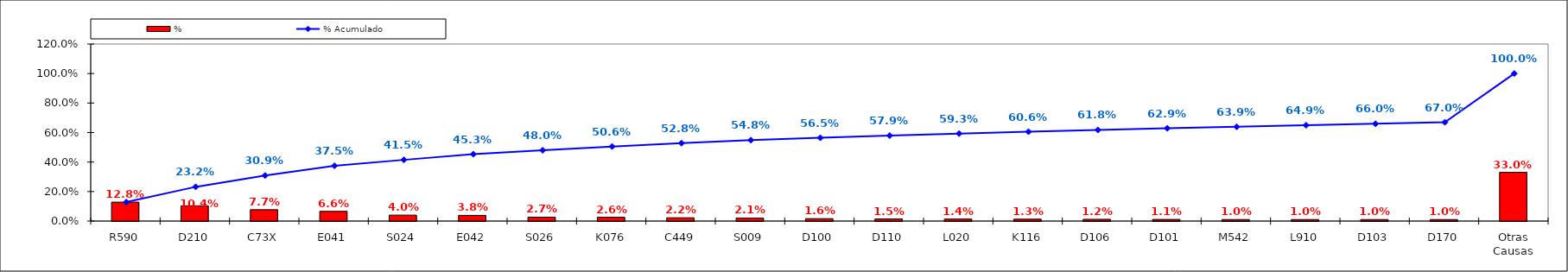
| Category | % |
|---|---|
| R590 | 0.128 |
| D210 | 0.104 |
| C73X | 0.077 |
| E041 | 0.066 |
| S024 | 0.04 |
| E042 | 0.038 |
| S026 | 0.027 |
| K076 | 0.026 |
| C449 | 0.022 |
| S009 | 0.021 |
| D100 | 0.016 |
| D110 | 0.015 |
| L020 | 0.014 |
| K116 | 0.013 |
| D106 | 0.012 |
| D101 | 0.011 |
| M542 | 0.01 |
| L910 | 0.01 |
| D103 | 0.01 |
| D170 | 0.01 |
| Otras Causas | 0.33 |